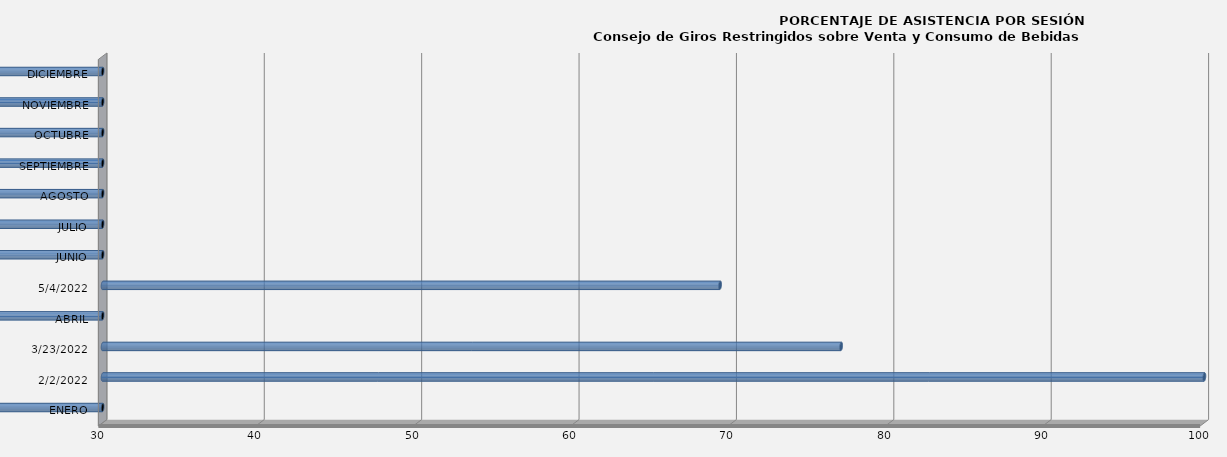
| Category | Series 0 |
|---|---|
| ENERO | 0 |
| 02/02/2022 | 100 |
| 23/03/2022 | 76.923 |
| ABRIL | 0 |
| 04/05/2022 | 69.231 |
| JUNIO | 0 |
| JULIO | 0 |
| AGOSTO | 0 |
| SEPTIEMBRE | 0 |
| OCTUBRE | 0 |
| NOVIEMBRE | 0 |
| DICIEMBRE | 0 |